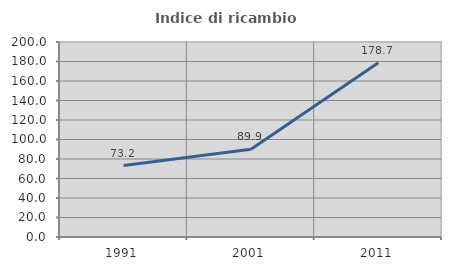
| Category | Indice di ricambio occupazionale  |
|---|---|
| 1991.0 | 73.235 |
| 2001.0 | 89.935 |
| 2011.0 | 178.656 |